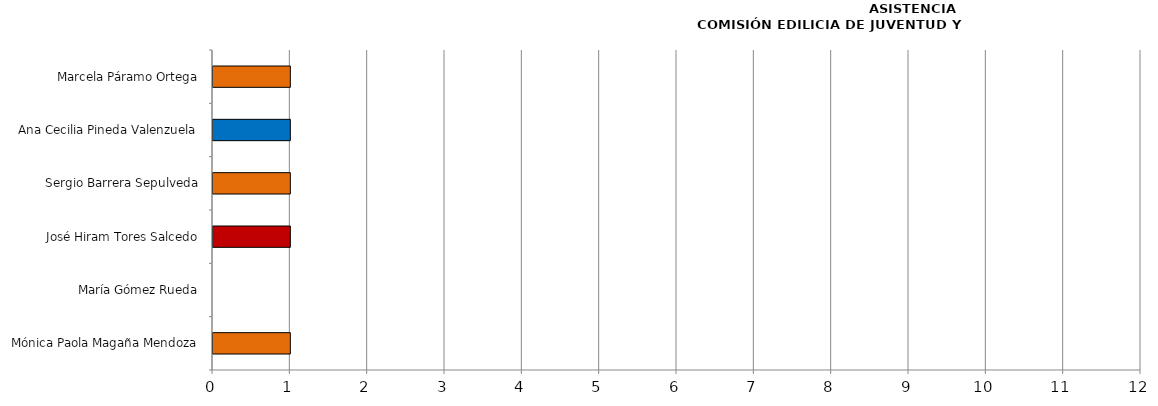
| Category | Series 0 |
|---|---|
| Mónica Paola Magaña Mendoza | 1 |
| María Gómez Rueda | 0 |
| José Hiram Tores Salcedo | 1 |
| Sergio Barrera Sepulveda | 1 |
| Ana Cecilia Pineda Valenzuela | 1 |
| Marcela Páramo Ortega | 1 |